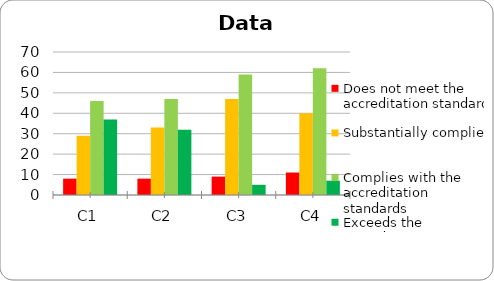
| Category | Does not meet the accreditation standard | Substantially complies | Complies with the accreditation standards | Exceeds the accreditation standards |
|---|---|---|---|---|
| C1 | 8 | 29 | 46 | 37 |
| C2 | 8 | 33 | 47 | 32 |
| C3 | 9 | 47 | 59 | 5 |
| C4 | 11 | 40 | 62 | 7 |